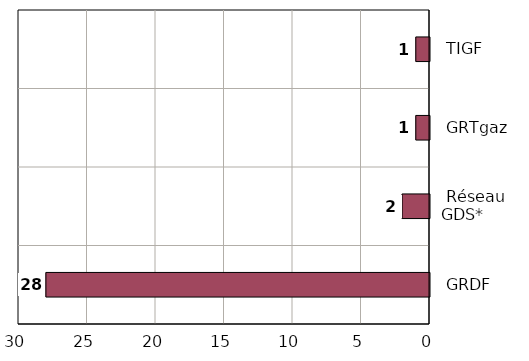
| Category | Nombre de projets raccordés au réseau |
|---|---|
| GRDF | 28 |
| Réseau GDS* | 2 |
| GRTgaz | 1 |
| TIGF | 1 |